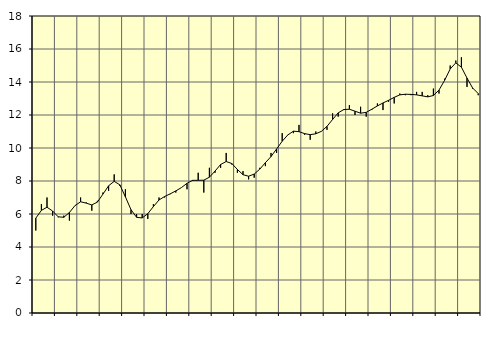
| Category | Piggar | Series 1 |
|---|---|---|
| nan | 5 | 5.75 |
| 1.0 | 6.6 | 6.22 |
| 1.0 | 7 | 6.41 |
| 1.0 | 5.9 | 6.18 |
| nan | 5.8 | 5.83 |
| 2.0 | 5.9 | 5.8 |
| 2.0 | 5.6 | 6.09 |
| 2.0 | 6.5 | 6.51 |
| nan | 7 | 6.74 |
| 3.0 | 6.7 | 6.66 |
| 3.0 | 6.2 | 6.55 |
| 3.0 | 6.8 | 6.72 |
| nan | 7.3 | 7.21 |
| 4.0 | 7.4 | 7.71 |
| 4.0 | 8.4 | 7.98 |
| 4.0 | 7.7 | 7.77 |
| nan | 7.5 | 7.04 |
| 5.0 | 6 | 6.26 |
| 5.0 | 6 | 5.8 |
| 5.0 | 6 | 5.76 |
| nan | 5.7 | 6.02 |
| 6.0 | 6.6 | 6.45 |
| 6.0 | 7 | 6.85 |
| 6.0 | 7 | 7.06 |
| nan | 7.2 | 7.22 |
| 7.0 | 7.3 | 7.4 |
| 7.0 | 7.6 | 7.6 |
| 7.0 | 7.5 | 7.86 |
| nan | 8 | 8.04 |
| 8.0 | 8.5 | 8.04 |
| 8.0 | 7.3 | 8.05 |
| 8.0 | 8.8 | 8.23 |
| nan | 8.5 | 8.6 |
| 9.0 | 8.8 | 9 |
| 9.0 | 9.7 | 9.18 |
| 9.0 | 9 | 9.06 |
| nan | 8.5 | 8.7 |
| 10.0 | 8.6 | 8.38 |
| 10.0 | 8.1 | 8.29 |
| 10.0 | 8.2 | 8.42 |
| nan | 8.8 | 8.72 |
| 11.0 | 8.9 | 9.11 |
| 11.0 | 9.7 | 9.48 |
| 11.0 | 9.7 | 9.94 |
| nan | 10.9 | 10.41 |
| 12.0 | 10.8 | 10.79 |
| 12.0 | 10.9 | 11.02 |
| 12.0 | 11.4 | 10.99 |
| nan | 10.8 | 10.87 |
| 13.0 | 10.5 | 10.81 |
| 13.0 | 11 | 10.86 |
| 13.0 | 11 | 11.01 |
| nan | 11.1 | 11.31 |
| 14.0 | 12.1 | 11.73 |
| 14.0 | 11.9 | 12.13 |
| 14.0 | 12.3 | 12.33 |
| nan | 12.6 | 12.35 |
| 15.0 | 12 | 12.23 |
| 15.0 | 12.5 | 12.11 |
| 15.0 | 11.9 | 12.16 |
| nan | 12.3 | 12.35 |
| 16.0 | 12.7 | 12.55 |
| 16.0 | 12.3 | 12.73 |
| 16.0 | 12.8 | 12.89 |
| nan | 12.7 | 13.07 |
| 17.0 | 13.3 | 13.22 |
| 17.0 | 13.2 | 13.26 |
| 17.0 | 13.2 | 13.25 |
| nan | 13.4 | 13.22 |
| 18.0 | 13.4 | 13.16 |
| 18.0 | 13.2 | 13.1 |
| 18.0 | 13.6 | 13.18 |
| nan | 13.3 | 13.51 |
| 19.0 | 14.2 | 14.1 |
| 19.0 | 15 | 14.79 |
| 19.0 | 15.3 | 15.16 |
| nan | 15.5 | 14.9 |
| 20.0 | 13.7 | 14.24 |
| 20.0 | 13.6 | 13.64 |
| 20.0 | 13.2 | 13.3 |